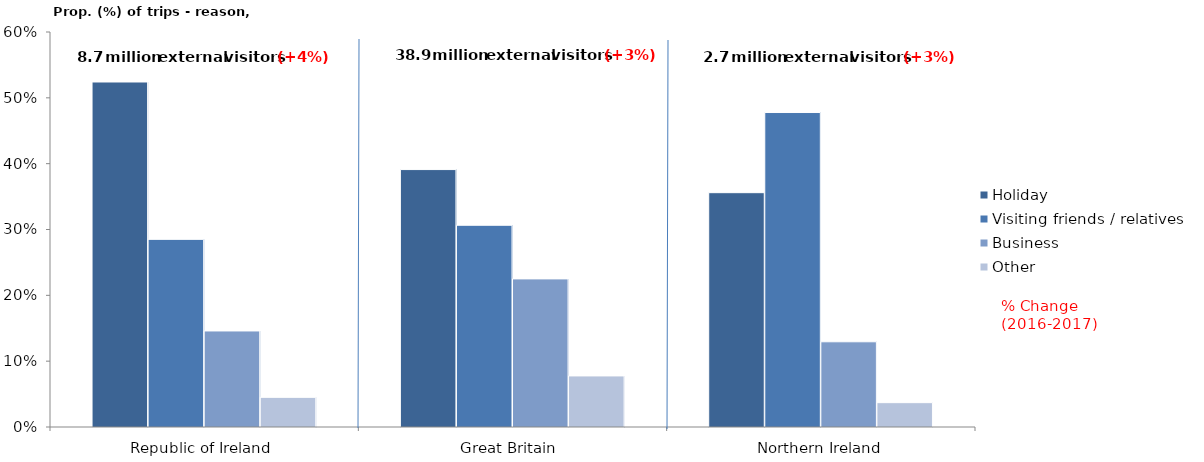
| Category | Holiday | Visiting friends / relatives  | Business | Other |
|---|---|---|---|---|
| Republic of Ireland  | 0.524 | 0.285 | 0.146 | 0.045 |
| Great Britain  | 0.391 | 0.306 | 0.225 | 0.078 |
| Northern Ireland | 0.356 | 0.478 | 0.129 | 0.037 |